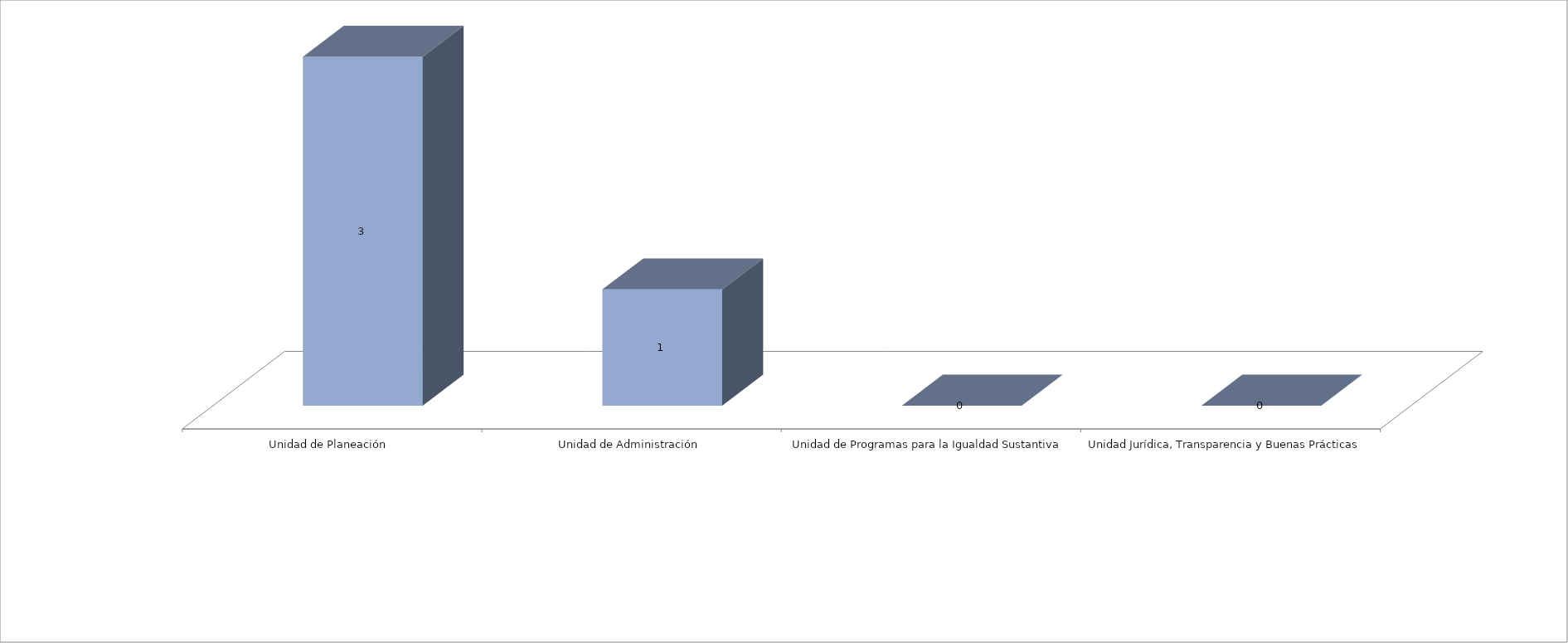
| Category | Series 0 | Series 1 |
|---|---|---|
| Unidad de Planeación  |  | 3 |
| Unidad de Administración |  | 1 |
| Unidad de Programas para la Igualdad Sustantiva |  | 0 |
| Unidad Jurídica, Transparencia y Buenas Prácticas  |  | 0 |